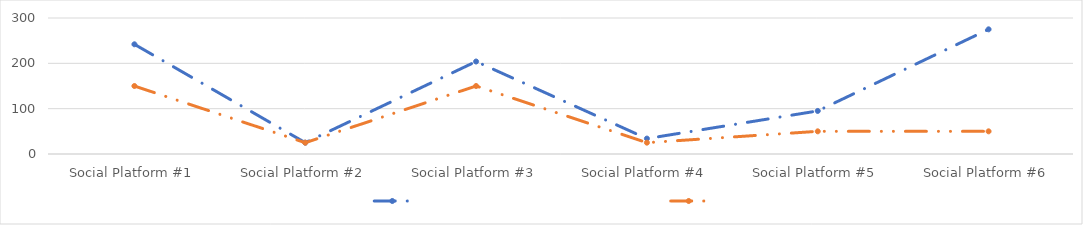
| Category | Series 0 | Series 1 |
|---|---|---|
| Social Platform #1 | 242 | 150 |
| Social Platform #2 | 25 | 25 |
| Social Platform #3 | 204 | 150 |
| Social Platform #4 | 34 | 25 |
| Social Platform #5 | 95 | 50 |
| Social Platform #6 | 275 | 50 |